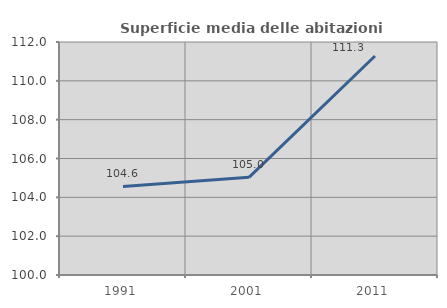
| Category | Superficie media delle abitazioni occupate |
|---|---|
| 1991.0 | 104.558 |
| 2001.0 | 105.03 |
| 2011.0 | 111.28 |